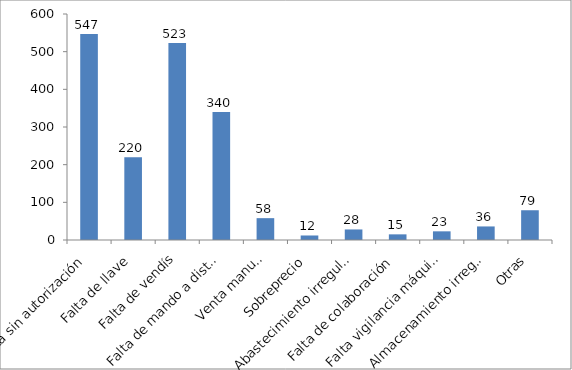
| Category | Expedientes iniciados en 2017 |
|---|---|
| Venta sin autorización | 547 |
| Falta de llave | 220 |
| Falta de vendís | 523 |
| Falta de mando a distancia | 340 |
| Venta manual | 58 |
| Sobreprecio | 12 |
| Abastecimiento irregular | 28 |
| Falta de colaboración | 15 |
| Falta vigilancia máquinas | 23 |
| Almacenamiento irregular | 36 |
| Otras | 79 |